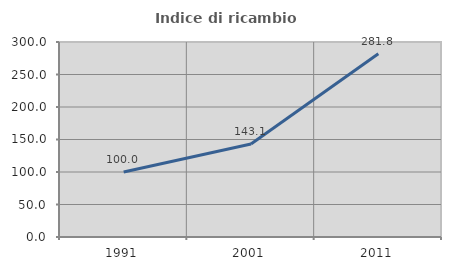
| Category | Indice di ricambio occupazionale  |
|---|---|
| 1991.0 | 100 |
| 2001.0 | 143.145 |
| 2011.0 | 281.789 |